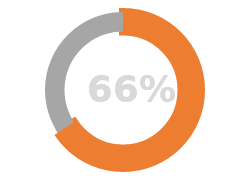
| Category | Series 0 |
|---|---|
| 0 | -0.658 |
| 1 | 0.342 |